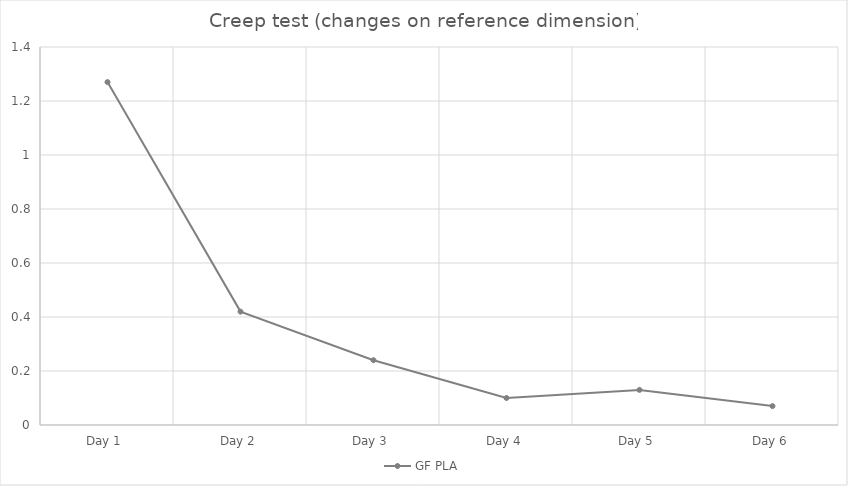
| Category | GF PLA |
|---|---|
| Day 1 | 1.27 |
| Day 2 | 0.42 |
| Day 3 | 0.24 |
| Day 4 | 0.1 |
| Day 5 | 0.13 |
| Day 6 | 0.07 |